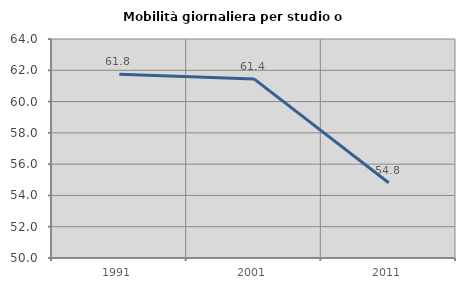
| Category | Mobilità giornaliera per studio o lavoro |
|---|---|
| 1991.0 | 61.751 |
| 2001.0 | 61.45 |
| 2011.0 | 54.808 |